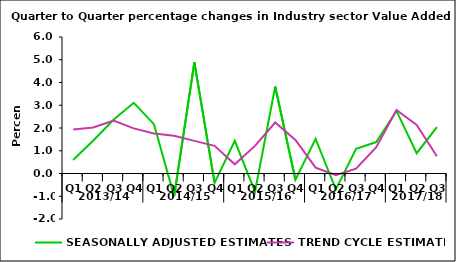
| Category | SEASONALLY ADJUSTED ESTIMATES | TREND CYCLE ESTIMATES |
|---|---|---|
| 0 | 0.596 | 1.932 |
| 1 | 1.452 | 2.023 |
| 2 | 2.364 | 2.328 |
| 3 | 3.109 | 1.982 |
| 4 | 2.169 | 1.76 |
| 5 | -0.994 | 1.655 |
| 6 | 4.89 | 1.434 |
| 7 | -0.41 | 1.216 |
| 8 | 1.438 | 0.403 |
| 9 | -0.801 | 1.212 |
| 10 | 3.826 | 2.242 |
| 11 | -0.273 | 1.477 |
| 12 | 1.523 | 0.26 |
| 13 | -0.7 | -0.077 |
| 14 | 1.085 | 0.215 |
| 15 | 1.383 | 1.153 |
| 16 | 2.75 | 2.793 |
| 17 | 0.891 | 2.135 |
| 18 | 2.036 | 0.756 |